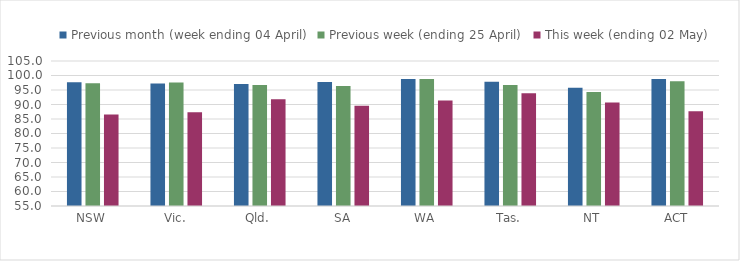
| Category | Previous month (week ending 04 April) | Previous week (ending 25 April) | This week (ending 02 May) |
|---|---|---|---|
| NSW | 97.664 | 97.289 | 86.522 |
| Vic. | 97.279 | 97.627 | 87.349 |
| Qld. | 97.101 | 96.732 | 91.789 |
| SA | 97.793 | 96.355 | 89.533 |
| WA | 98.774 | 98.81 | 91.417 |
| Tas. | 97.813 | 96.724 | 93.912 |
| NT | 95.792 | 94.304 | 90.648 |
| ACT | 98.794 | 98.025 | 87.675 |